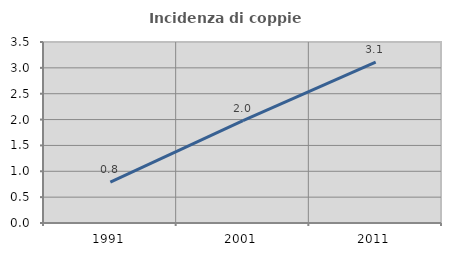
| Category | Incidenza di coppie miste |
|---|---|
| 1991.0 | 0.788 |
| 2001.0 | 1.981 |
| 2011.0 | 3.11 |